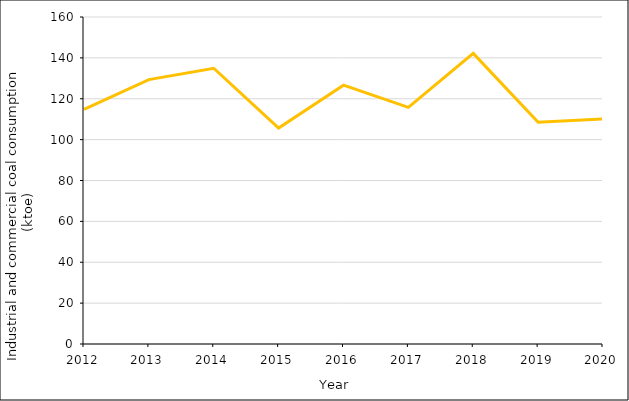
| Category | Coal: Industrial and commercial (thousands tonnes of oil equivalent (ktoe)) |
|---|---|
| 2012.0 | 114.829 |
| 2013.0 | 129.382 |
| 2014.0 | 134.925 |
| 2015.0 | 105.666 |
| 2016.0 | 126.646 |
| 2017.0 | 115.799 |
| 2018.0 | 142.183 |
| 2019.0 | 108.538 |
| 2020.0 | 110.055 |